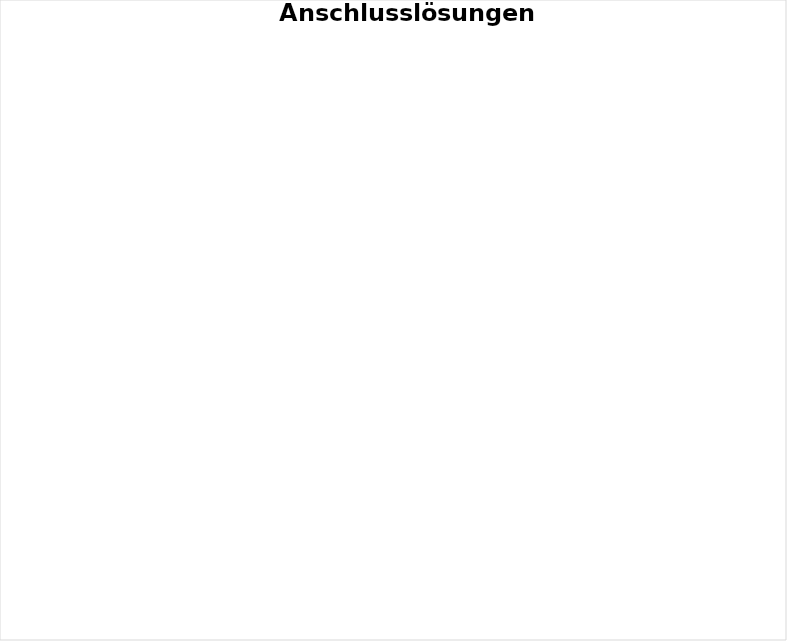
| Category | Series 0 |
|---|---|
| Wohnen in selbstfinanzierter Wohnung | 0 |
| Wohnen im institutionellen Rahmen | 0 |
| Wohnen bei Eltern / Angehörigen | 0 |
| Klinikaufenthalt | 0 |
| Andere Lösung (WG, Lerlingsunterkunft, etc) | 0 |